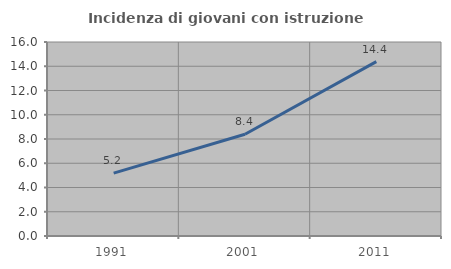
| Category | Incidenza di giovani con istruzione universitaria |
|---|---|
| 1991.0 | 5.188 |
| 2001.0 | 8.393 |
| 2011.0 | 14.377 |